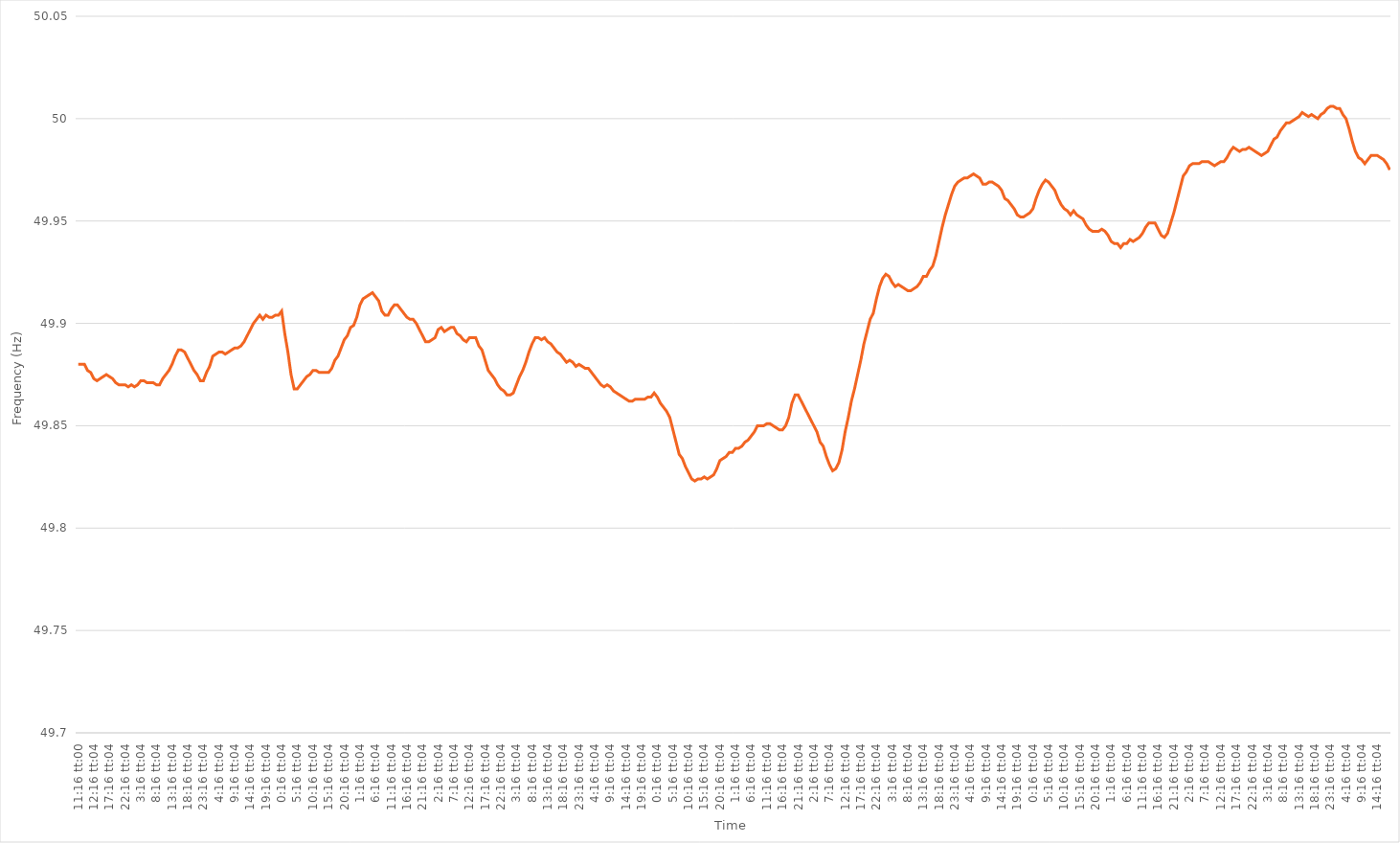
| Category | Series 0 |
|---|---|
| 0.4694444444444445 | 49.88 |
| 0.46945601851851854 | 49.88 |
| 0.46946759259259263 | 49.88 |
| 0.46947916666666667 | 49.877 |
| 0.4694907407407407 | 49.876 |
| 0.511157407407407 | 49.873 |
| 0.552824074074074 | 49.872 |
| 0.594490740740741 | 49.873 |
| 0.636157407407407 | 49.874 |
| 0.677824074074074 | 49.875 |
| 0.719490740740741 | 49.874 |
| 0.761157407407407 | 49.873 |
| 0.802824074074074 | 49.871 |
| 0.844490740740741 | 49.87 |
| 0.886157407407407 | 49.87 |
| 0.927824074074074 | 49.87 |
| 0.969490740740741 | 49.869 |
| 1900-01-01 00:16:04 | 49.87 |
| 1900-01-01 01:16:04 | 49.869 |
| 1900-01-01 02:16:04 | 49.87 |
| 1900-01-01 03:16:04 | 49.872 |
| 1900-01-01 04:16:04 | 49.872 |
| 1900-01-01 05:16:04 | 49.871 |
| 1900-01-01 06:16:04 | 49.871 |
| 1900-01-01 07:16:04 | 49.871 |
| 1900-01-01 08:16:04 | 49.87 |
| 1900-01-01 09:16:04 | 49.87 |
| 1900-01-01 10:16:04 | 49.873 |
| 1900-01-01 11:16:04 | 49.875 |
| 1900-01-01 12:16:04 | 49.877 |
| 1900-01-01 13:16:04 | 49.88 |
| 1900-01-01 14:16:04 | 49.884 |
| 1900-01-01 15:16:04 | 49.887 |
| 1900-01-01 16:16:04 | 49.887 |
| 1900-01-01 17:16:04 | 49.886 |
| 1900-01-01 18:16:04 | 49.883 |
| 1900-01-01 19:16:04 | 49.88 |
| 1900-01-01 20:16:04 | 49.877 |
| 1900-01-01 21:16:04 | 49.875 |
| 1900-01-01 22:16:04 | 49.872 |
| 1900-01-01 23:16:04 | 49.872 |
| 1900-01-02 00:16:04 | 49.876 |
| 1900-01-02 01:16:04 | 49.879 |
| 1900-01-02 02:16:04 | 49.884 |
| 1900-01-02 03:16:04 | 49.885 |
| 1900-01-02 04:16:04 | 49.886 |
| 1900-01-02 05:16:04 | 49.886 |
| 1900-01-02 06:16:04 | 49.885 |
| 1900-01-02 07:16:04 | 49.886 |
| 1900-01-02 08:16:04 | 49.887 |
| 1900-01-02 09:16:04 | 49.888 |
| 1900-01-02 10:16:04 | 49.888 |
| 1900-01-02 11:16:04 | 49.889 |
| 1900-01-02 12:16:04 | 49.891 |
| 1900-01-02 13:16:04 | 49.894 |
| 1900-01-02 14:16:04 | 49.897 |
| 1900-01-02 15:16:04 | 49.9 |
| 1900-01-02 16:16:04 | 49.902 |
| 1900-01-02 17:16:04 | 49.904 |
| 1900-01-02 18:16:04 | 49.902 |
| 1900-01-02 19:16:04 | 49.904 |
| 1900-01-02 20:16:04 | 49.903 |
| 1900-01-02 21:16:04 | 49.903 |
| 1900-01-02 22:16:04 | 49.904 |
| 1900-01-02 23:16:04 | 49.904 |
| 1900-01-03 00:16:04 | 49.906 |
| 1900-01-03 01:16:04 | 49.895 |
| 1900-01-03 02:16:04 | 49.886 |
| 1900-01-03 03:16:04 | 49.875 |
| 1900-01-03 04:16:04 | 49.868 |
| 1900-01-03 05:16:04 | 49.868 |
| 1900-01-03 06:16:04 | 49.87 |
| 1900-01-03 07:16:04 | 49.872 |
| 1900-01-03 08:16:04 | 49.874 |
| 1900-01-03 09:16:04 | 49.875 |
| 1900-01-03 10:16:04 | 49.877 |
| 1900-01-03 11:16:04 | 49.877 |
| 1900-01-03 12:16:04 | 49.876 |
| 1900-01-03 13:16:04 | 49.876 |
| 1900-01-03 14:16:04 | 49.876 |
| 1900-01-03 15:16:04 | 49.876 |
| 1900-01-03 16:16:04 | 49.878 |
| 1900-01-03 17:16:04 | 49.882 |
| 1900-01-03 18:16:04 | 49.884 |
| 1900-01-03 19:16:04 | 49.888 |
| 1900-01-03 20:16:04 | 49.892 |
| 1900-01-03 21:16:04 | 49.894 |
| 1900-01-03 22:16:04 | 49.898 |
| 1900-01-03 23:16:04 | 49.899 |
| 1900-01-04 00:16:04 | 49.903 |
| 1900-01-04 01:16:04 | 49.909 |
| 1900-01-04 02:16:04 | 49.912 |
| 1900-01-04 03:16:04 | 49.913 |
| 1900-01-04 04:16:04 | 49.914 |
| 1900-01-04 05:16:04 | 49.915 |
| 1900-01-04 06:16:04 | 49.913 |
| 1900-01-04 07:16:04 | 49.911 |
| 1900-01-04 08:16:04 | 49.906 |
| 1900-01-04 09:16:04 | 49.904 |
| 1900-01-04 10:16:04 | 49.904 |
| 1900-01-04 11:16:04 | 49.907 |
| 1900-01-04 12:16:04 | 49.909 |
| 1900-01-04 13:16:04 | 49.909 |
| 1900-01-04 14:16:04 | 49.907 |
| 1900-01-04 15:16:04 | 49.905 |
| 1900-01-04 16:16:04 | 49.903 |
| 1900-01-04 17:16:04 | 49.902 |
| 1900-01-04 18:16:04 | 49.902 |
| 1900-01-04 19:16:04 | 49.9 |
| 1900-01-04 20:16:04 | 49.897 |
| 1900-01-04 21:16:04 | 49.894 |
| 1900-01-04 22:16:04 | 49.891 |
| 1900-01-04 23:16:04 | 49.891 |
| 1900-01-05 00:16:04 | 49.892 |
| 1900-01-05 01:16:04 | 49.893 |
| 1900-01-05 02:16:04 | 49.897 |
| 1900-01-05 03:16:04 | 49.898 |
| 1900-01-05 04:16:04 | 49.896 |
| 1900-01-05 05:16:04 | 49.897 |
| 1900-01-05 06:16:04 | 49.898 |
| 1900-01-05 07:16:04 | 49.898 |
| 1900-01-05 08:16:04 | 49.895 |
| 1900-01-05 09:16:04 | 49.894 |
| 1900-01-05 10:16:04 | 49.892 |
| 1900-01-05 11:16:04 | 49.891 |
| 1900-01-05 12:16:04 | 49.893 |
| 1900-01-05 13:16:04 | 49.893 |
| 1900-01-05 14:16:04 | 49.893 |
| 1900-01-05 15:16:04 | 49.889 |
| 1900-01-05 16:16:04 | 49.887 |
| 1900-01-05 17:16:04 | 49.882 |
| 1900-01-05 18:16:04 | 49.877 |
| 1900-01-05 19:16:04 | 49.875 |
| 1900-01-05 20:16:04 | 49.873 |
| 1900-01-05 21:16:04 | 49.87 |
| 1900-01-05 22:16:04 | 49.868 |
| 1900-01-05 23:16:04 | 49.867 |
| 1900-01-06 00:16:04 | 49.865 |
| 1900-01-06 01:16:04 | 49.865 |
| 1900-01-06 02:16:04 | 49.866 |
| 1900-01-06 03:16:04 | 49.87 |
| 1900-01-06 04:16:04 | 49.874 |
| 1900-01-06 05:16:04 | 49.877 |
| 1900-01-06 06:16:04 | 49.881 |
| 1900-01-06 07:16:04 | 49.886 |
| 1900-01-06 08:16:04 | 49.89 |
| 1900-01-06 09:16:04 | 49.893 |
| 1900-01-06 10:16:04 | 49.893 |
| 1900-01-06 11:16:04 | 49.892 |
| 1900-01-06 12:16:04 | 49.893 |
| 1900-01-06 13:16:04 | 49.891 |
| 1900-01-06 14:16:04 | 49.89 |
| 1900-01-06 15:16:04 | 49.888 |
| 1900-01-06 16:16:04 | 49.886 |
| 1900-01-06 17:16:04 | 49.885 |
| 1900-01-06 18:16:04 | 49.883 |
| 1900-01-06 19:16:04 | 49.881 |
| 1900-01-06 20:16:04 | 49.882 |
| 1900-01-06 21:16:04 | 49.881 |
| 1900-01-06 22:16:04 | 49.879 |
| 1900-01-06 23:16:04 | 49.88 |
| 1900-01-07 00:16:04 | 49.879 |
| 1900-01-07 01:16:04 | 49.878 |
| 1900-01-07 02:16:04 | 49.878 |
| 1900-01-07 03:16:04 | 49.876 |
| 1900-01-07 04:16:04 | 49.874 |
| 1900-01-07 05:16:04 | 49.872 |
| 1900-01-07 06:16:04 | 49.87 |
| 1900-01-07 07:16:04 | 49.869 |
| 1900-01-07 08:16:04 | 49.87 |
| 1900-01-07 09:16:04 | 49.869 |
| 1900-01-07 10:16:04 | 49.867 |
| 1900-01-07 11:16:04 | 49.866 |
| 1900-01-07 12:16:04 | 49.865 |
| 1900-01-07 13:16:04 | 49.864 |
| 1900-01-07 14:16:04 | 49.863 |
| 1900-01-07 15:16:04 | 49.862 |
| 1900-01-07 16:16:04 | 49.862 |
| 1900-01-07 17:16:04 | 49.863 |
| 1900-01-07 18:16:04 | 49.863 |
| 1900-01-07 19:16:04 | 49.863 |
| 1900-01-07 20:16:04 | 49.863 |
| 1900-01-07 21:16:04 | 49.864 |
| 1900-01-07 22:16:04 | 49.864 |
| 1900-01-07 23:16:04 | 49.866 |
| 1900-01-08 00:16:04 | 49.864 |
| 1900-01-08 01:16:04 | 49.861 |
| 1900-01-08 02:16:04 | 49.859 |
| 1900-01-08 03:16:04 | 49.857 |
| 1900-01-08 04:16:04 | 49.854 |
| 1900-01-08 05:16:04 | 49.848 |
| 1900-01-08 06:16:04 | 49.842 |
| 1900-01-08 07:16:04 | 49.836 |
| 1900-01-08 08:16:04 | 49.834 |
| 1900-01-08 09:16:04 | 49.83 |
| 1900-01-08 10:16:04 | 49.827 |
| 1900-01-08 11:16:04 | 49.824 |
| 1900-01-08 12:16:04 | 49.823 |
| 1900-01-08 13:16:04 | 49.824 |
| 1900-01-08 14:16:04 | 49.824 |
| 1900-01-08 15:16:04 | 49.825 |
| 1900-01-08 16:16:04 | 49.824 |
| 1900-01-08 17:16:04 | 49.825 |
| 1900-01-08 18:16:04 | 49.826 |
| 1900-01-08 19:16:04 | 49.829 |
| 1900-01-08 20:16:04 | 49.833 |
| 1900-01-08 21:16:04 | 49.834 |
| 1900-01-08 22:16:04 | 49.835 |
| 1900-01-08 23:16:04 | 49.837 |
| 1900-01-09 00:16:04 | 49.837 |
| 1900-01-09 01:16:04 | 49.839 |
| 1900-01-09 02:16:04 | 49.839 |
| 1900-01-09 03:16:04 | 49.84 |
| 1900-01-09 04:16:04 | 49.842 |
| 1900-01-09 05:16:04 | 49.843 |
| 1900-01-09 06:16:04 | 49.845 |
| 1900-01-09 07:16:04 | 49.847 |
| 1900-01-09 08:16:04 | 49.85 |
| 1900-01-09 09:16:04 | 49.85 |
| 1900-01-09 10:16:04 | 49.85 |
| 1900-01-09 11:16:04 | 49.851 |
| 1900-01-09 12:16:04 | 49.851 |
| 1900-01-09 13:16:04 | 49.85 |
| 1900-01-09 14:16:04 | 49.849 |
| 1900-01-09 15:16:04 | 49.848 |
| 1900-01-09 16:16:04 | 49.848 |
| 1900-01-09 17:16:04 | 49.85 |
| 1900-01-09 18:16:04 | 49.854 |
| 1900-01-09 19:16:04 | 49.861 |
| 1900-01-09 20:16:04 | 49.865 |
| 1900-01-09 21:16:04 | 49.865 |
| 1900-01-09 22:16:04 | 49.862 |
| 1900-01-09 23:16:04 | 49.859 |
| 1900-01-10 00:16:04 | 49.856 |
| 1900-01-10 01:16:04 | 49.853 |
| 1900-01-10 02:16:04 | 49.85 |
| 1900-01-10 03:16:04 | 49.847 |
| 1900-01-10 04:16:04 | 49.842 |
| 1900-01-10 05:16:04 | 49.84 |
| 1900-01-10 06:16:04 | 49.835 |
| 1900-01-10 07:16:04 | 49.831 |
| 1900-01-10 08:16:04 | 49.828 |
| 1900-01-10 09:16:04 | 49.829 |
| 1900-01-10 10:16:04 | 49.832 |
| 1900-01-10 11:16:04 | 49.838 |
| 1900-01-10 12:16:04 | 49.847 |
| 1900-01-10 13:16:04 | 49.854 |
| 1900-01-10 14:16:04 | 49.862 |
| 1900-01-10 15:16:04 | 49.868 |
| 1900-01-10 16:16:04 | 49.875 |
| 1900-01-10 17:16:04 | 49.882 |
| 1900-01-10 18:16:04 | 49.89 |
| 1900-01-10 19:16:04 | 49.896 |
| 1900-01-10 20:16:04 | 49.902 |
| 1900-01-10 21:16:04 | 49.905 |
| 1900-01-10 22:16:04 | 49.912 |
| 1900-01-10 23:16:04 | 49.918 |
| 1900-01-11 00:16:04 | 49.922 |
| 1900-01-11 01:16:04 | 49.924 |
| 1900-01-11 02:16:04 | 49.923 |
| 1900-01-11 03:16:04 | 49.92 |
| 1900-01-11 04:16:04 | 49.918 |
| 1900-01-11 05:16:04 | 49.919 |
| 1900-01-11 06:16:04 | 49.918 |
| 1900-01-11 07:16:04 | 49.917 |
| 1900-01-11 08:16:04 | 49.916 |
| 1900-01-11 09:16:04 | 49.916 |
| 1900-01-11 10:16:04 | 49.917 |
| 1900-01-11 11:16:04 | 49.918 |
| 1900-01-11 12:16:04 | 49.92 |
| 1900-01-11 13:16:04 | 49.923 |
| 1900-01-11 14:16:04 | 49.923 |
| 1900-01-11 15:16:04 | 49.926 |
| 1900-01-11 16:16:04 | 49.928 |
| 1900-01-11 17:16:04 | 49.933 |
| 1900-01-11 18:16:04 | 49.94 |
| 1900-01-11 19:16:04 | 49.947 |
| 1900-01-11 20:16:04 | 49.953 |
| 1900-01-11 21:16:04 | 49.958 |
| 1900-01-11 22:16:04 | 49.963 |
| 1900-01-11 23:16:04 | 49.967 |
| 1900-01-12 00:16:04 | 49.969 |
| 1900-01-12 01:16:04 | 49.97 |
| 1900-01-12 02:16:04 | 49.971 |
| 1900-01-12 03:16:04 | 49.971 |
| 1900-01-12 04:16:04 | 49.972 |
| 1900-01-12 05:16:04 | 49.973 |
| 1900-01-12 06:16:04 | 49.972 |
| 1900-01-12 07:16:04 | 49.971 |
| 1900-01-12 08:16:04 | 49.968 |
| 1900-01-12 09:16:04 | 49.968 |
| 1900-01-12 10:16:04 | 49.969 |
| 1900-01-12 11:16:04 | 49.969 |
| 1900-01-12 12:16:04 | 49.968 |
| 1900-01-12 13:16:04 | 49.967 |
| 1900-01-12 14:16:04 | 49.965 |
| 1900-01-12 15:16:04 | 49.961 |
| 1900-01-12 16:16:04 | 49.96 |
| 1900-01-12 17:16:04 | 49.958 |
| 1900-01-12 18:16:04 | 49.956 |
| 1900-01-12 19:16:04 | 49.953 |
| 1900-01-12 20:16:04 | 49.952 |
| 1900-01-12 21:16:04 | 49.952 |
| 1900-01-12 22:16:04 | 49.953 |
| 1900-01-12 23:16:04 | 49.954 |
| 1900-01-13 00:16:04 | 49.956 |
| 1900-01-13 01:16:04 | 49.961 |
| 1900-01-13 02:16:04 | 49.965 |
| 1900-01-13 03:16:04 | 49.968 |
| 1900-01-13 04:16:04 | 49.97 |
| 1900-01-13 05:16:04 | 49.969 |
| 1900-01-13 06:16:04 | 49.967 |
| 1900-01-13 07:16:04 | 49.965 |
| 1900-01-13 08:16:04 | 49.961 |
| 1900-01-13 09:16:04 | 49.958 |
| 1900-01-13 10:16:04 | 49.956 |
| 1900-01-13 11:16:04 | 49.955 |
| 1900-01-13 12:16:04 | 49.953 |
| 1900-01-13 13:16:04 | 49.955 |
| 1900-01-13 14:16:04 | 49.953 |
| 1900-01-13 15:16:04 | 49.952 |
| 1900-01-13 16:16:04 | 49.951 |
| 1900-01-13 17:16:04 | 49.948 |
| 1900-01-13 18:16:04 | 49.946 |
| 1900-01-13 19:16:04 | 49.945 |
| 1900-01-13 20:16:04 | 49.945 |
| 1900-01-13 21:16:04 | 49.945 |
| 1900-01-13 22:16:04 | 49.946 |
| 1900-01-13 23:16:04 | 49.945 |
| 1900-01-14 00:16:04 | 49.943 |
| 1900-01-14 01:16:04 | 49.94 |
| 1900-01-14 02:16:04 | 49.939 |
| 1900-01-14 03:16:04 | 49.939 |
| 1900-01-14 04:16:04 | 49.937 |
| 1900-01-14 05:16:04 | 49.939 |
| 1900-01-14 06:16:04 | 49.939 |
| 1900-01-14 07:16:04 | 49.941 |
| 1900-01-14 08:16:04 | 49.94 |
| 1900-01-14 09:16:04 | 49.941 |
| 1900-01-14 10:16:04 | 49.942 |
| 1900-01-14 11:16:04 | 49.944 |
| 1900-01-14 12:16:04 | 49.947 |
| 1900-01-14 13:16:04 | 49.949 |
| 1900-01-14 14:16:04 | 49.949 |
| 1900-01-14 15:16:04 | 49.949 |
| 1900-01-14 16:16:04 | 49.946 |
| 1900-01-14 17:16:04 | 49.943 |
| 1900-01-14 18:16:04 | 49.942 |
| 1900-01-14 19:16:04 | 49.944 |
| 1900-01-14 20:16:04 | 49.949 |
| 1900-01-14 21:16:04 | 49.954 |
| 1900-01-14 22:16:04 | 49.96 |
| 1900-01-14 23:16:04 | 49.966 |
| 1900-01-15 00:16:04 | 49.972 |
| 1900-01-15 01:16:04 | 49.974 |
| 1900-01-15 02:16:04 | 49.977 |
| 1900-01-15 03:16:04 | 49.978 |
| 1900-01-15 04:16:04 | 49.978 |
| 1900-01-15 05:16:04 | 49.978 |
| 1900-01-15 06:16:04 | 49.979 |
| 1900-01-15 07:16:04 | 49.979 |
| 1900-01-15 08:16:04 | 49.979 |
| 1900-01-15 09:16:04 | 49.978 |
| 1900-01-15 10:16:04 | 49.977 |
| 1900-01-15 11:16:04 | 49.978 |
| 1900-01-15 12:16:04 | 49.979 |
| 1900-01-15 13:16:04 | 49.979 |
| 1900-01-15 14:16:04 | 49.981 |
| 1900-01-15 15:16:04 | 49.984 |
| 1900-01-15 16:16:04 | 49.986 |
| 1900-01-15 17:16:04 | 49.985 |
| 1900-01-15 18:16:04 | 49.984 |
| 1900-01-15 19:16:04 | 49.985 |
| 1900-01-15 20:16:04 | 49.985 |
| 1900-01-15 21:16:04 | 49.986 |
| 1900-01-15 22:16:04 | 49.985 |
| 1900-01-15 23:16:04 | 49.984 |
| 1900-01-16 00:16:04 | 49.983 |
| 1900-01-16 01:16:04 | 49.982 |
| 1900-01-16 02:16:04 | 49.983 |
| 1900-01-16 03:16:04 | 49.984 |
| 1900-01-16 04:16:04 | 49.987 |
| 1900-01-16 05:16:04 | 49.99 |
| 1900-01-16 06:16:04 | 49.991 |
| 1900-01-16 07:16:04 | 49.994 |
| 1900-01-16 08:16:04 | 49.996 |
| 1900-01-16 09:16:04 | 49.998 |
| 1900-01-16 10:16:04 | 49.998 |
| 1900-01-16 11:16:04 | 49.999 |
| 1900-01-16 12:16:04 | 50 |
| 1900-01-16 13:16:04 | 50.001 |
| 1900-01-16 14:16:04 | 50.003 |
| 1900-01-16 15:16:04 | 50.002 |
| 1900-01-16 16:16:04 | 50.001 |
| 1900-01-16 17:16:04 | 50.002 |
| 1900-01-16 18:16:04 | 50.001 |
| 1900-01-16 19:16:04 | 50 |
| 1900-01-16 20:16:04 | 50.002 |
| 1900-01-16 21:16:04 | 50.003 |
| 1900-01-16 22:16:04 | 50.005 |
| 1900-01-16 23:16:04 | 50.006 |
| 1900-01-17 00:16:04 | 50.006 |
| 1900-01-17 01:16:04 | 50.005 |
| 1900-01-17 02:16:04 | 50.005 |
| 1900-01-17 03:16:04 | 50.002 |
| 1900-01-17 04:16:04 | 50 |
| 1900-01-17 05:16:04 | 49.995 |
| 1900-01-17 06:16:04 | 49.989 |
| 1900-01-17 07:16:04 | 49.984 |
| 1900-01-17 08:16:04 | 49.981 |
| 1900-01-17 09:16:04 | 49.98 |
| 1900-01-17 10:16:04 | 49.978 |
| 1900-01-17 11:16:04 | 49.98 |
| 1900-01-17 12:16:04 | 49.982 |
| 1900-01-17 13:16:04 | 49.982 |
| 1900-01-17 14:16:04 | 49.982 |
| 1900-01-17 15:16:04 | 49.981 |
| 1900-01-17 16:16:04 | 49.98 |
| 1900-01-17 17:16:04 | 49.978 |
| 1900-01-17 18:16:04 | 49.975 |